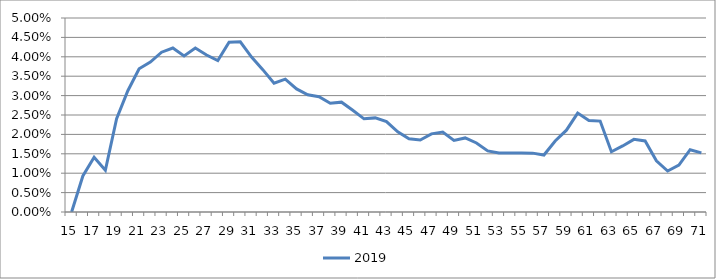
| Category | 2019 |
|---|---|
| 15.0 | 0 |
| 16.0 | 0.009 |
| 17.0 | 0.014 |
| 18.0 | 0.011 |
| 19.0 | 0.024 |
| 20.0 | 0.031 |
| 21.0 | 0.037 |
| 22.0 | 0.039 |
| 23.0 | 0.041 |
| 24.0 | 0.042 |
| 25.0 | 0.04 |
| 26.0 | 0.042 |
| 27.0 | 0.04 |
| 28.0 | 0.039 |
| 29.0 | 0.044 |
| 30.0 | 0.044 |
| 31.0 | 0.04 |
| 32.0 | 0.037 |
| 33.0 | 0.033 |
| 34.0 | 0.034 |
| 35.0 | 0.032 |
| 36.0 | 0.03 |
| 37.0 | 0.03 |
| 38.0 | 0.028 |
| 39.0 | 0.028 |
| 40.0 | 0.026 |
| 41.0 | 0.024 |
| 42.0 | 0.024 |
| 43.0 | 0.023 |
| 44.0 | 0.021 |
| 45.0 | 0.019 |
| 46.0 | 0.019 |
| 47.0 | 0.02 |
| 48.0 | 0.021 |
| 49.0 | 0.018 |
| 50.0 | 0.019 |
| 51.0 | 0.018 |
| 52.0 | 0.016 |
| 53.0 | 0.015 |
| 54.0 | 0.015 |
| 55.0 | 0.015 |
| 56.0 | 0.015 |
| 57.0 | 0.015 |
| 58.0 | 0.018 |
| 59.0 | 0.021 |
| 60.0 | 0.025 |
| 61.0 | 0.024 |
| 62.0 | 0.023 |
| 63.0 | 0.016 |
| 64.0 | 0.017 |
| 65.0 | 0.019 |
| 66.0 | 0.018 |
| 67.0 | 0.013 |
| 68.0 | 0.011 |
| 69.0 | 0.012 |
| 70.0 | 0.016 |
| 71.0 | 0.015 |